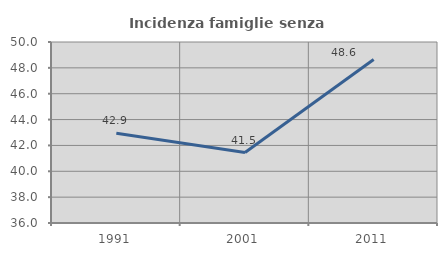
| Category | Incidenza famiglie senza nuclei |
|---|---|
| 1991.0 | 42.938 |
| 2001.0 | 41.451 |
| 2011.0 | 48.649 |